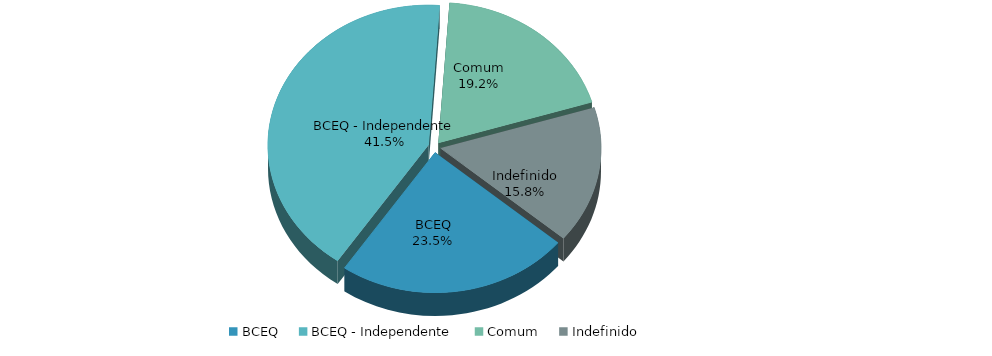
| Category | Series 0 |
|---|---|
| BCEQ | 14224 |
| BCEQ - Independente | 25195 |
| Comum | 11645 |
| Indefinido | 9585 |